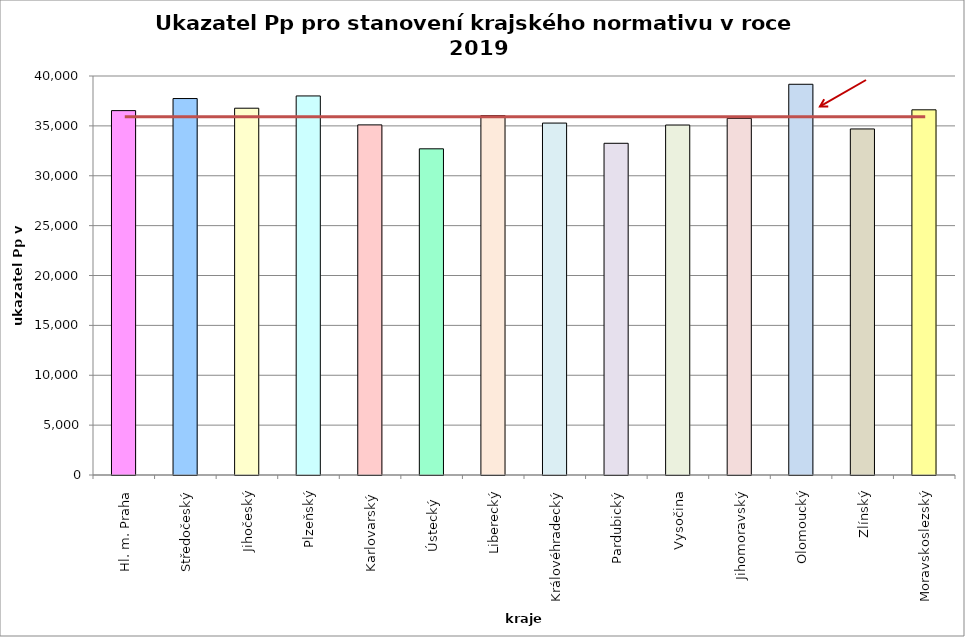
| Category | Series 0 |
|---|---|
| Hl. m. Praha | 36530 |
| Středočeský | 37740 |
| Jihočeský | 36771 |
| Plzeňský | 38000 |
| Karlovarský  | 35100 |
| Ústecký   | 32700 |
| Liberecký | 36040 |
| Královéhradecký | 35281 |
| Pardubický | 33254 |
| Vysočina | 35086 |
| Jihomoravský | 35755 |
| Olomoucký | 39171 |
| Zlínský | 34692 |
| Moravskoslezský | 36610 |